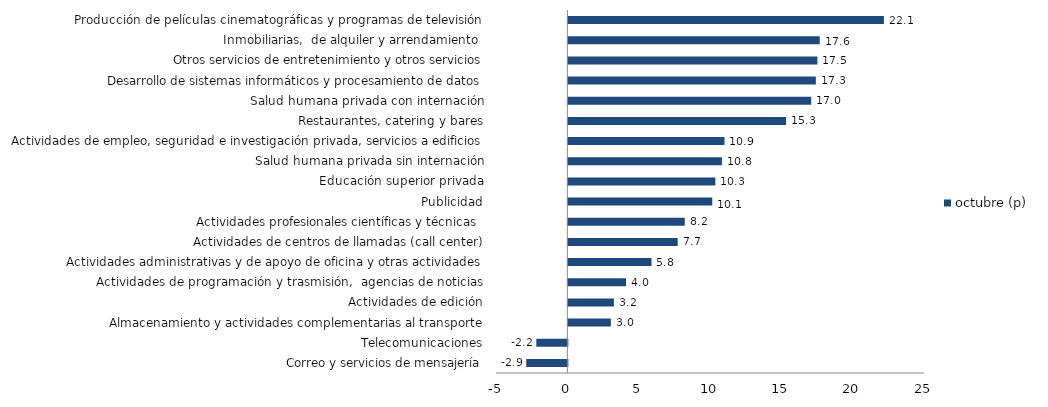
| Category | octubre (p) |
|---|---|
| Correo y servicios de mensajería | -2.88 |
| Telecomunicaciones | -2.175 |
| Almacenamiento y actividades complementarias al transporte | 2.978 |
| Actividades de edición | 3.195 |
| Actividades de programación y trasmisión,  agencias de noticias | 4.045 |
| Actividades administrativas y de apoyo de oficina y otras actividades | 5.829 |
| Actividades de centros de llamadas (call center) | 7.668 |
| Actividades profesionales científicas y técnicas  | 8.162 |
| Publicidad | 10.088 |
| Educación superior privada | 10.305 |
| Salud humana privada sin internación | 10.765 |
| Actividades de empleo, seguridad e investigación privada, servicios a edificios | 10.946 |
| Restaurantes, catering y bares | 15.26 |
| Salud humana privada con internación | 17.024 |
| Desarrollo de sistemas informáticos y procesamiento de datos | 17.35 |
| Otros servicios de entretenimiento y otros servicios | 17.455 |
| Inmobiliarias,  de alquiler y arrendamiento  | 17.622 |
| Producción de películas cinematográficas y programas de televisión | 22.12 |